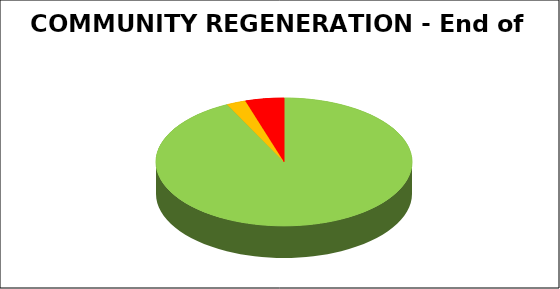
| Category | Series 0 |
|---|---|
| Green | 0.927 |
| Amber | 0.024 |
| Red | 0.049 |